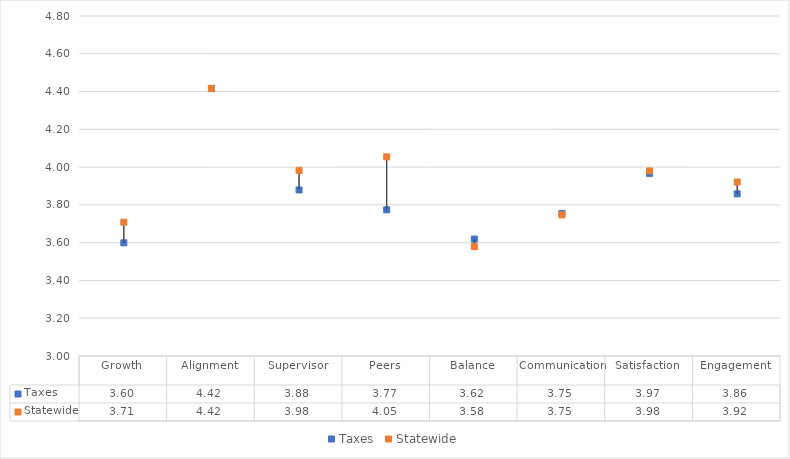
| Category | Taxes | Statewide |
|---|---|---|
| Growth | 3.599 | 3.708 |
| Alignment | 4.417 | 4.417 |
| Supervisor | 3.879 | 3.983 |
| Peers | 3.774 | 4.054 |
| Balance | 3.619 | 3.579 |
| Communication | 3.755 | 3.747 |
| Satisfaction | 3.967 | 3.98 |
| Engagement | 3.858 | 3.921 |